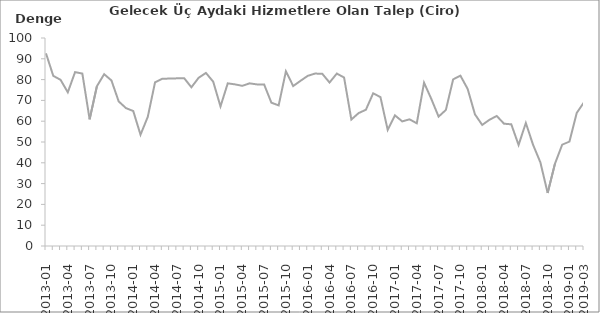
| Category | Denge  |
|---|---|
| 2013-01 | 92.6 |
|  | 81.8 |
|  | 79.9 |
| 2013-04 | 73.9 |
|  | 83.6 |
|  | 82.9 |
| 2013-07 | 60.9 |
|  | 76.8 |
|  | 82.6 |
| 2013-10 | 79.6 |
|  | 69.5 |
|  | 66.3 |
| 2014-01 | 64.9 |
|  | 53.5 |
|  | 62.1 |
| 2014-04 | 78.7 |
|  | 80.4 |
|  | 80.5 |
| 2014-07 | 80.6 |
|  | 80.7 |
|  | 76.3 |
| 2014-10 | 80.9 |
|  | 83.2 |
|  | 79 |
| 2015-01 | 67.1 |
|  | 78.2 |
|  | 77.7 |
| 2015-04 | 77 |
|  | 78.2 |
|  | 77.7 |
| 2015-07 | 77.7 |
|  | 68.9 |
|  | 67.6 |
| 2015-10 | 84 |
|  | 76.9 |
|  | 79.4 |
| 2016-01 | 81.8 |
|  | 82.9 |
|  | 82.8 |
| 2016-04 | 78.6 |
|  | 82.9 |
|  | 81 |
| 2016-07 | 60.8 |
|  | 63.9 |
|  | 65.5 |
| 2016-10 | 73.4 |
|  | 71.6 |
|  | 55.8 |
| 2017-01 | 62.8 |
|  | 59.9 |
|  | 60.9 |
| 2017-04 | 59 |
|  | 78.5 |
|  | 70.7 |
| 2017-07 | 62.2 |
|  | 65.4 |
|  | 80.1 |
| 2017-10 | 81.9 |
|  | 75.5 |
|  | 63.3 |
| 2018-01 | 58.2 |
|  | 60.7 |
|  | 62.5 |
| 2018-04 | 58.8 |
|  | 58.5 |
|  | 48.6 |
| 2018-07 | 59.1 |
|  | 48.6 |
|  | 40.2 |
| 2018-10 | 25.5 |
|  | 39.5 |
|  | 48.7 |
| 2019-01 | 50.2 |
|  | 64 |
| 2019-03 | 69.1 |